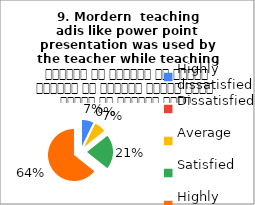
| Category |  9. Mordern  teaching 
adis like power point presentation was used by the teacher while teaching  शिक्षक ने शिक्षण के दौरान शिक्षण की आधुनिक तकनीक पावर पॉइंट का प्रयोग किया |
|---|---|
| Highly dissatisfied | 1 |
| Dissatisfied | 0 |
| Average | 1 |
| Satisfied | 3 |
| Highly satisfied | 9 |